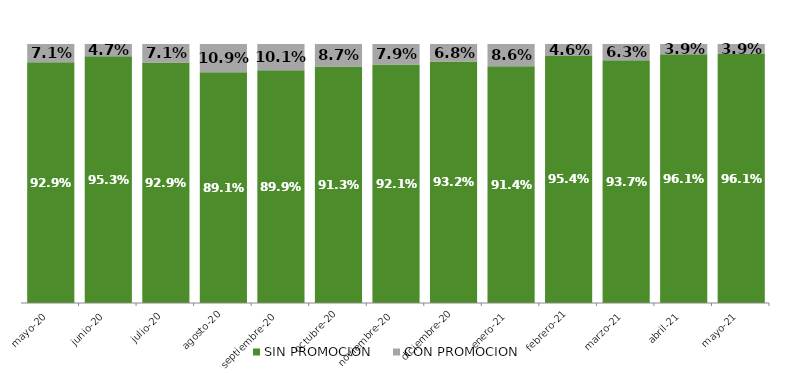
| Category | SIN PROMOCION   | CON PROMOCION   |
|---|---|---|
| 2020-05-01 | 0.929 | 0.071 |
| 2020-06-01 | 0.953 | 0.047 |
| 2020-07-01 | 0.929 | 0.071 |
| 2020-08-01 | 0.891 | 0.109 |
| 2020-09-01 | 0.899 | 0.101 |
| 2020-10-01 | 0.913 | 0.087 |
| 2020-11-01 | 0.921 | 0.079 |
| 2020-12-01 | 0.932 | 0.068 |
| 2021-01-01 | 0.914 | 0.086 |
| 2021-02-01 | 0.954 | 0.046 |
| 2021-03-01 | 0.937 | 0.063 |
| 2021-04-01 | 0.961 | 0.039 |
| 2021-05-01 | 0.961 | 0.039 |